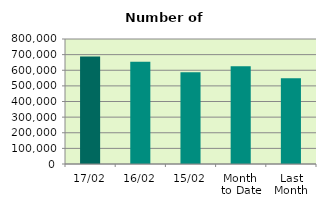
| Category | Series 0 |
|---|---|
| 17/02 | 688268 |
| 16/02 | 654850 |
| 15/02 | 587138 |
| Month 
to Date | 626367.692 |
| Last
Month | 549126.273 |